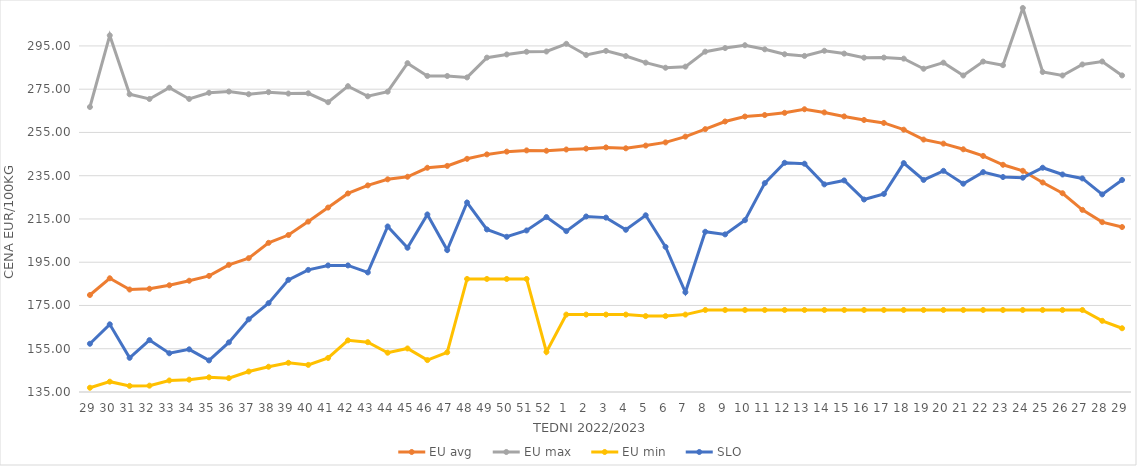
| Category | EU avg | EU max | EU min | SLO |
|---|---|---|---|---|
| 29.0 | 179.847 | 266.77 | 136.97 | 157.31 |
| 30.0 | 187.576 | 299.87 | 139.777 | 166.29 |
| 31.0 | 182.385 | 272.64 | 137.828 | 150.81 |
| 32.0 | 182.73 | 270.47 | 137.934 | 158.99 |
| 33.0 | 184.343 | 275.68 | 140.33 | 152.91 |
| 34.0 | 186.448 | 270.49 | 140.7 | 154.73 |
| 35.0 | 188.684 | 273.33 | 141.78 | 149.6 |
| 36.0 | 193.792 | 273.91 | 141.41 | 157.93 |
| 37.0 | 196.877 | 272.67 | 144.47 | 168.61 |
| 38.0 | 203.962 | 273.63 | 146.68 | 176.07 |
| 39.0 | 207.574 | 272.98 | 148.499 | 186.86 |
| 40.0 | 213.785 | 273.1 | 147.54 | 191.45 |
| 41.0 | 220.272 | 268.98 | 150.75 | 193.52 |
| 42.0 | 226.803 | 276.39 | 158.87 | 193.52 |
| 43.0 | 230.521 | 271.72 | 158.04 | 190.28 |
| 44.0 | 233.325 | 273.856 | 153.16 | 211.53 |
| 45.0 | 234.517 | 287.021 | 155.13 | 201.69 |
| 46.0 | 238.669 | 281.133 | 149.75 | 217.08 |
| 47.0 | 239.534 | 281.102 | 153.36 | 200.62 |
| 48.0 | 242.81 | 280.434 | 187.26 | 222.61 |
| 49.0 | 244.854 | 289.585 | 187.26 | 210.16 |
| 50.0 | 246.132 | 291.057 | 187.26 | 206.76 |
| 51.0 | 246.705 | 292.307 | 187.26 | 209.69 |
| 52.0 | 246.546 | 292.426 | 153.54 | 215.87 |
| 1.0 | 247.118 | 295.98 | 170.79 | 209.37 |
| 2.0 | 247.516 | 290.8 | 170.79 | 216.15 |
| 3.0 | 248.079 | 292.71 | 170.79 | 215.63 |
| 4.0 | 247.672 | 290.32 | 170.79 | 210 |
| 5.0 | 248.924 | 287.27 | 170.09 | 216.7 |
| 6.0 | 250.4 | 284.92 | 170.09 | 202.1 |
| 7.0 | 253.074 | 285.42 | 170.79 | 181.11 |
| 8.0 | 256.543 | 292.35 | 172.91 | 209.08 |
| 9.0 | 260.066 | 294.02 | 172.91 | 207.87 |
| 10.0 | 262.352 | 295.33 | 172.91 | 214.42 |
| 11.0 | 263.049 | 293.44 | 172.91 | 231.56 |
| 12.0 | 264.068 | 291.15 | 172.91 | 240.97 |
| 13.0 | 265.73 | 290.38 | 172.91 | 240.55 |
| 14.0 | 264.262 | 292.763 | 172.91 | 230.99 |
| 15.0 | 262.411 | 291.46 | 172.91 | 232.82 |
| 16.0 | 260.77 | 289.56 | 172.91 | 224 |
| 17.0 | 259.395 | 289.61 | 172.91 | 226.57 |
| 18.0 | 256.275 | 289.13 | 172.91 | 240.83 |
| 19.0 | 251.716 | 284.45 | 172.91 | 233.05 |
| 20.0 | 249.836 | 287.26 | 172.91 | 237.25 |
| 21.0 | 247.212 | 281.33 | 172.91 | 231.3 |
| 22.0 | 244.135 | 287.77 | 172.91 | 236.67 |
| 23.0 | 240.051 | 286.1 | 172.91 | 234.39 |
| 24.0 | 237.269 | 312.54 | 172.91 | 234.08 |
| 25.0 | 231.874 | 282.95 | 172.91 | 238.69 |
| 26.0 | 226.9 | 281.34 | 172.91 | 235.57 |
| 27.0 | 219.2 | 286.43 | 172.91 | 233.75 |
| 28.0 | 213.534 | 287.8 | 167.9 | 226.35 |
| 29.0 | 211.27 | 281.37 | 164.47 | 233.03 |